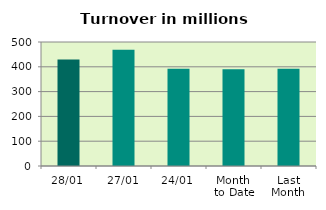
| Category | Series 0 |
|---|---|
| 28/01 | 429.681 |
| 27/01 | 469.229 |
| 24/01 | 392.493 |
| Month 
to Date | 390.161 |
| Last
Month | 391.769 |